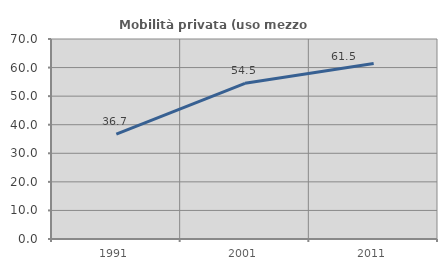
| Category | Mobilità privata (uso mezzo privato) |
|---|---|
| 1991.0 | 36.738 |
| 2001.0 | 54.497 |
| 2011.0 | 61.46 |